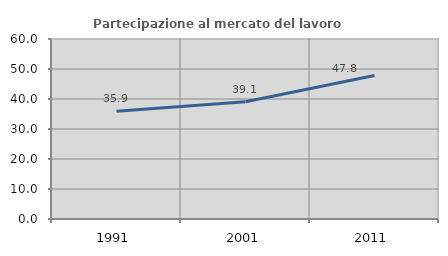
| Category | Partecipazione al mercato del lavoro  femminile |
|---|---|
| 1991.0 | 35.941 |
| 2001.0 | 39.076 |
| 2011.0 | 47.819 |